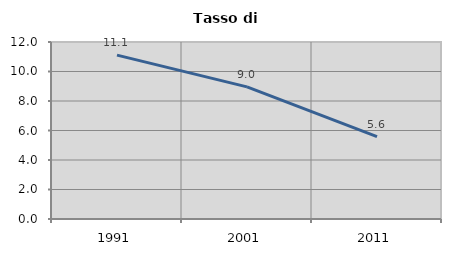
| Category | Tasso di disoccupazione   |
|---|---|
| 1991.0 | 11.111 |
| 2001.0 | 8.955 |
| 2011.0 | 5.59 |